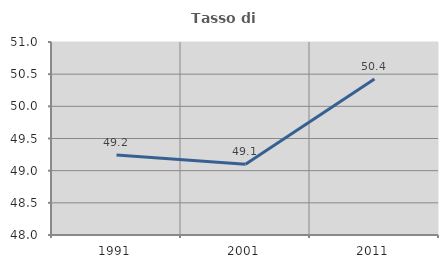
| Category | Tasso di occupazione   |
|---|---|
| 1991.0 | 49.245 |
| 2001.0 | 49.1 |
| 2011.0 | 50.425 |